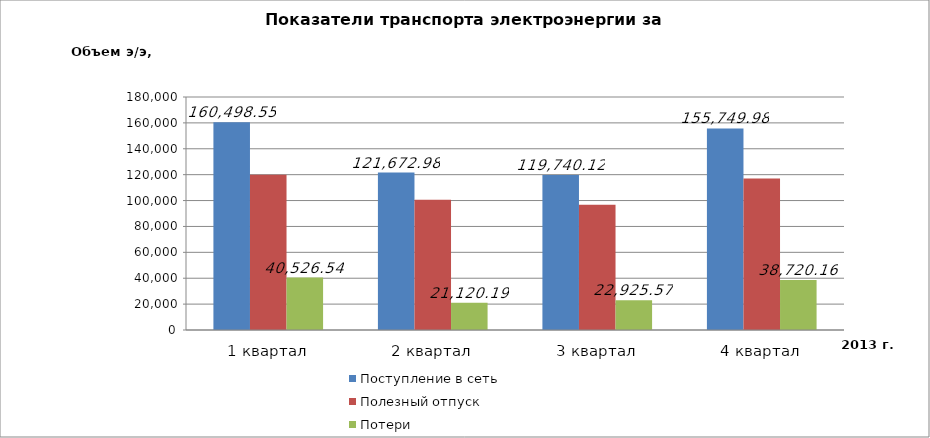
| Category | Поступление в сеть | Полезный отпуск | Потери |
|---|---|---|---|
| 1 квартал | 160498.554 | 119972.011 | 40526.543 |
| 2 квартал | 121672.978 | 100552.792 | 21120.186 |
| 3 квартал | 119740.123 | 96814.56 | 22925.569 |
| 4 квартал | 155749.979 | 117029.819 | 38720.16 |